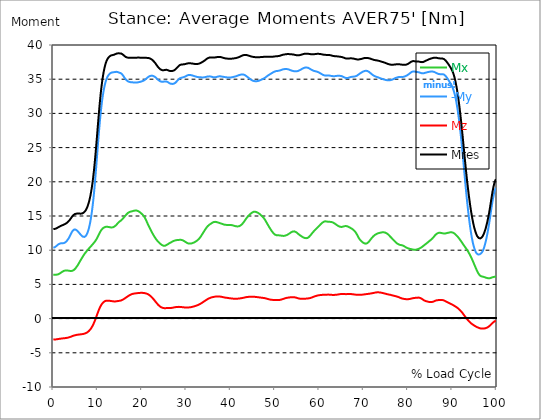
| Category |  Mx |  -My |  Mz |  Mres |
|---|---|---|---|---|
| 0.0 | 6.42 | 10.355 | -3.063 | 13.086 |
| 0.167348456675344 | 6.42 | 10.393 | -3.053 | 13.095 |
| 0.334696913350688 | 6.42 | 10.44 | -3.053 | 13.114 |
| 0.5020453700260321 | 6.42 | 10.516 | -3.044 | 13.152 |
| 0.669393826701376 | 6.42 | 10.601 | -3.034 | 13.19 |
| 0.83674228337672 | 6.429 | 10.705 | -3.015 | 13.247 |
| 1.0040907400520642 | 6.457 | 10.8 | -2.996 | 13.313 |
| 1.1621420602454444 | 6.495 | 10.876 | -2.977 | 13.379 |
| 1.3294905169207885 | 6.552 | 10.933 | -2.958 | 13.436 |
| 1.4968389735961325 | 6.619 | 10.971 | -2.949 | 13.493 |
| 1.6641874302714765 | 6.694 | 10.999 | -2.93 | 13.55 |
| 1.8315358869468206 | 6.77 | 11.009 | -2.911 | 13.598 |
| 1.9988843436221646 | 6.846 | 11.009 | -2.902 | 13.645 |
| 2.1662328002975086 | 6.913 | 11.018 | -2.892 | 13.692 |
| 2.333581256972853 | 6.969 | 11.037 | -2.873 | 13.73 |
| 2.5009297136481967 | 7.007 | 11.075 | -2.864 | 13.778 |
| 2.6682781703235405 | 7.026 | 11.132 | -2.854 | 13.835 |
| 2.8356266269988843 | 7.036 | 11.218 | -2.835 | 13.901 |
| 3.002975083674229 | 7.036 | 11.331 | -2.816 | 13.977 |
| 3.1703235403495724 | 7.026 | 11.464 | -2.797 | 14.062 |
| 3.337671997024917 | 7.017 | 11.625 | -2.778 | 14.167 |
| 3.4957233172182973 | 6.998 | 11.796 | -2.75 | 14.28 |
| 3.663071773893641 | 6.979 | 11.995 | -2.712 | 14.404 |
| 3.8304202305689854 | 6.969 | 12.204 | -2.674 | 14.546 |
| 3.997768687244329 | 6.96 | 12.431 | -2.636 | 14.707 |
| 4.165117143919673 | 6.969 | 12.64 | -2.589 | 14.868 |
| 4.332465600595017 | 6.998 | 12.811 | -2.541 | 15.01 |
| 4.499814057270361 | 7.045 | 12.934 | -2.503 | 15.124 |
| 4.667162513945706 | 7.131 | 13.01 | -2.475 | 15.21 |
| 4.834510970621049 | 7.225 | 13.029 | -2.437 | 15.276 |
| 5.001859427296393 | 7.349 | 13.01 | -2.418 | 15.323 |
| 5.169207883971737 | 7.491 | 12.953 | -2.39 | 15.342 |
| 5.336556340647081 | 7.652 | 12.877 | -2.371 | 15.361 |
| 5.503904797322425 | 7.813 | 12.773 | -2.352 | 15.361 |
| 5.671253253997769 | 7.994 | 12.649 | -2.342 | 15.361 |
| 5.82930457419115 | 8.183 | 12.526 | -2.333 | 15.352 |
| 5.996653030866494 | 8.373 | 12.393 | -2.314 | 15.342 |
| 6.164001487541838 | 8.553 | 12.261 | -2.304 | 15.342 |
| 6.331349944217181 | 8.743 | 12.147 | -2.285 | 15.361 |
| 6.498698400892526 | 8.913 | 12.042 | -2.276 | 15.38 |
| 6.66604685756787 | 9.094 | 11.976 | -2.257 | 15.428 |
| 6.833395314243213 | 9.264 | 11.938 | -2.228 | 15.494 |
| 7.000743770918558 | 9.425 | 11.938 | -2.2 | 15.589 |
| 7.168092227593902 | 9.577 | 11.986 | -2.171 | 15.712 |
| 7.335440684269246 | 9.719 | 12.099 | -2.124 | 15.873 |
| 7.50278914094459 | 9.852 | 12.27 | -2.067 | 16.082 |
| 7.6701375976199335 | 9.975 | 12.498 | -2.001 | 16.328 |
| 7.837486054295278 | 10.108 | 12.801 | -1.915 | 16.632 |
| 7.995537374488658 | 10.231 | 13.171 | -1.821 | 16.983 |
| 8.162885831164003 | 10.355 | 13.626 | -1.707 | 17.409 |
| 8.330234287839346 | 10.478 | 14.157 | -1.584 | 17.893 |
| 8.49758274451469 | 10.592 | 14.783 | -1.432 | 18.471 |
| 8.664931201190035 | 10.715 | 15.513 | -1.261 | 19.126 |
| 8.832279657865378 | 10.838 | 16.347 | -1.071 | 19.884 |
| 8.999628114540721 | 10.962 | 17.296 | -0.853 | 20.747 |
| 9.166976571216066 | 11.094 | 18.358 | -0.616 | 21.714 |
| 9.334325027891412 | 11.227 | 19.543 | -0.351 | 22.795 |
| 9.501673484566755 | 11.379 | 20.833 | -0.066 | 23.99 |
| 9.669021941242098 | 11.549 | 22.198 | 0.228 | 25.261 |
| 9.836370397917442 | 11.73 | 23.601 | 0.522 | 26.588 |
| 10.003718854592787 | 11.938 | 25.005 | 0.825 | 27.925 |
| 10.17106731126813 | 12.156 | 26.38 | 1.109 | 29.253 |
| 10.329118631461512 | 12.374 | 27.688 | 1.375 | 30.523 |
| 10.496467088136853 | 12.592 | 28.902 | 1.621 | 31.718 |
| 10.663815544812199 | 12.792 | 30.011 | 1.83 | 32.809 |
| 10.831164001487544 | 12.962 | 31.007 | 2.02 | 33.776 |
| 10.998512458162887 | 13.095 | 31.879 | 2.181 | 34.629 |
| 11.16586091483823 | 13.209 | 32.638 | 2.314 | 35.369 |
| 11.333209371513574 | 13.285 | 33.292 | 2.418 | 36.004 |
| 11.50055782818892 | 13.342 | 33.861 | 2.503 | 36.545 |
| 11.667906284864264 | 13.389 | 34.335 | 2.56 | 37 |
| 11.835254741539607 | 13.417 | 34.724 | 2.598 | 37.379 |
| 12.00260319821495 | 13.427 | 35.037 | 2.627 | 37.673 |
| 12.169951654890292 | 13.427 | 35.293 | 2.636 | 37.901 |
| 12.337300111565641 | 13.408 | 35.492 | 2.627 | 38.081 |
| 12.504648568240984 | 13.389 | 35.644 | 2.617 | 38.223 |
| 12.662699888434362 | 13.361 | 35.767 | 2.608 | 38.327 |
| 12.830048345109708 | 13.342 | 35.862 | 2.589 | 38.413 |
| 12.997396801785053 | 13.323 | 35.928 | 2.57 | 38.47 |
| 13.164745258460396 | 13.323 | 35.976 | 2.56 | 38.508 |
| 13.33209371513574 | 13.332 | 35.995 | 2.541 | 38.526 |
| 13.499442171811083 | 13.361 | 36.014 | 2.522 | 38.545 |
| 13.666790628486426 | 13.408 | 36.023 | 2.513 | 38.574 |
| 13.834139085161771 | 13.484 | 36.042 | 2.513 | 38.612 |
| 14.001487541837117 | 13.569 | 36.061 | 2.513 | 38.669 |
| 14.16883599851246 | 13.673 | 36.08 | 2.522 | 38.726 |
| 14.336184455187803 | 13.797 | 36.08 | 2.541 | 38.764 |
| 14.503532911863147 | 13.92 | 36.052 | 2.56 | 38.783 |
| 14.670881368538492 | 14.043 | 36.004 | 2.579 | 38.783 |
| 14.828932688731873 | 14.148 | 35.957 | 2.598 | 38.773 |
| 14.996281145407215 | 14.233 | 35.919 | 2.608 | 38.773 |
| 15.163629602082558 | 14.299 | 35.9 | 2.636 | 38.773 |
| 15.330978058757903 | 14.385 | 35.834 | 2.665 | 38.745 |
| 15.498326515433247 | 14.489 | 35.729 | 2.712 | 38.697 |
| 15.665674972108594 | 14.603 | 35.587 | 2.769 | 38.612 |
| 15.833023428783937 | 14.735 | 35.426 | 2.835 | 38.517 |
| 16.00037188545928 | 14.868 | 35.255 | 2.902 | 38.413 |
| 16.167720342134626 | 15.001 | 35.103 | 2.977 | 38.327 |
| 16.335068798809967 | 15.124 | 34.971 | 3.053 | 38.252 |
| 16.502417255485312 | 15.238 | 34.857 | 3.129 | 38.204 |
| 16.669765712160658 | 15.352 | 34.762 | 3.205 | 38.166 |
| 16.837114168836 | 15.456 | 34.686 | 3.281 | 38.138 |
| 17.004462625511344 | 15.532 | 34.639 | 3.347 | 38.128 |
| 17.16251394570472 | 15.579 | 34.601 | 3.414 | 38.119 |
| 17.32986240238007 | 15.627 | 34.572 | 3.471 | 38.119 |
| 17.497210859055414 | 15.655 | 34.553 | 3.527 | 38.119 |
| 17.664559315730756 | 15.674 | 34.544 | 3.575 | 38.128 |
| 17.8319077724061 | 15.703 | 34.544 | 3.603 | 38.128 |
| 17.999256229081443 | 15.741 | 34.534 | 3.632 | 38.138 |
| 18.166604685756788 | 15.769 | 34.515 | 3.651 | 38.147 |
| 18.333953142432133 | 15.797 | 34.506 | 3.67 | 38.147 |
| 18.501301599107478 | 15.807 | 34.506 | 3.689 | 38.147 |
| 18.668650055782823 | 15.807 | 34.506 | 3.698 | 38.147 |
| 18.835998512458165 | 15.788 | 34.515 | 3.717 | 38.157 |
| 19.00334696913351 | 15.75 | 34.525 | 3.727 | 38.157 |
| 19.170695425808855 | 15.703 | 34.553 | 3.736 | 38.157 |
| 19.338043882484197 | 15.636 | 34.572 | 3.745 | 38.157 |
| 19.496095202677576 | 15.56 | 34.601 | 3.755 | 38.157 |
| 19.66344365935292 | 15.475 | 34.629 | 3.764 | 38.147 |
| 19.830792116028263 | 15.38 | 34.658 | 3.764 | 38.138 |
| 19.998140572703612 | 15.276 | 34.696 | 3.764 | 38.128 |
| 20.165489029378953 | 15.172 | 34.743 | 3.764 | 38.128 |
| 20.3328374860543 | 15.048 | 34.79 | 3.755 | 38.128 |
| 20.500185942729644 | 14.897 | 34.847 | 3.736 | 38.128 |
| 20.667534399404985 | 14.716 | 34.923 | 3.717 | 38.119 |
| 20.83488285608033 | 14.508 | 35.009 | 3.689 | 38.119 |
| 21.002231312755672 | 14.271 | 35.113 | 3.66 | 38.119 |
| 21.16957976943102 | 14.024 | 35.208 | 3.613 | 38.119 |
| 21.336928226106362 | 13.787 | 35.293 | 3.565 | 38.109 |
| 21.504276682781704 | 13.56 | 35.369 | 3.499 | 38.09 |
| 21.67162513945705 | 13.342 | 35.435 | 3.433 | 38.062 |
| 21.82967645965043 | 13.123 | 35.473 | 3.347 | 38.024 |
| 21.997024916325774 | 12.915 | 35.502 | 3.252 | 37.967 |
| 22.16437337300112 | 12.706 | 35.521 | 3.148 | 37.901 |
| 22.33172182967646 | 12.498 | 35.511 | 3.034 | 37.815 |
| 22.499070286351806 | 12.308 | 35.483 | 2.911 | 37.711 |
| 22.666418743027148 | 12.118 | 35.445 | 2.788 | 37.597 |
| 22.833767199702496 | 11.948 | 35.378 | 2.646 | 37.474 |
| 23.00111565637784 | 11.777 | 35.303 | 2.513 | 37.341 |
| 23.168464113053183 | 11.616 | 35.208 | 2.38 | 37.189 |
| 23.335812569728528 | 11.474 | 35.094 | 2.247 | 37.028 |
| 23.50316102640387 | 11.341 | 34.99 | 2.124 | 36.877 |
| 23.670509483079215 | 11.218 | 34.895 | 2.001 | 36.734 |
| 23.83785793975456 | 11.113 | 34.809 | 1.896 | 36.621 |
| 23.995909259947936 | 11.009 | 34.734 | 1.802 | 36.516 |
| 24.163257716623285 | 10.914 | 34.677 | 1.726 | 36.431 |
| 24.330606173298627 | 10.829 | 34.648 | 1.659 | 36.365 |
| 24.49795462997397 | 10.753 | 34.629 | 1.612 | 36.327 |
| 24.665303086649313 | 10.687 | 34.629 | 1.574 | 36.308 |
| 24.83265154332466 | 10.649 | 34.639 | 1.536 | 36.308 |
| 25.0 | 10.63 | 34.658 | 1.527 | 36.317 |
| 25.167348456675345 | 10.649 | 34.677 | 1.517 | 36.346 |
| 25.334696913350694 | 10.696 | 34.696 | 1.527 | 36.374 |
| 25.502045370026035 | 10.753 | 34.677 | 1.536 | 36.383 |
| 25.669393826701377 | 10.819 | 34.639 | 1.546 | 36.365 |
| 25.836742283376722 | 10.876 | 34.572 | 1.536 | 36.317 |
| 26.004090740052067 | 10.943 | 34.487 | 1.536 | 36.27 |
| 26.17143919672741 | 11.018 | 34.421 | 1.536 | 36.222 |
| 26.329490516920792 | 11.075 | 34.364 | 1.536 | 36.194 |
| 26.49683897359613 | 11.132 | 34.335 | 1.546 | 36.184 |
| 26.66418743027148 | 11.189 | 34.316 | 1.565 | 36.184 |
| 26.831535886946828 | 11.255 | 34.307 | 1.584 | 36.203 |
| 26.998884343622166 | 11.312 | 34.316 | 1.603 | 36.232 |
| 27.166232800297514 | 11.36 | 34.345 | 1.621 | 36.27 |
| 27.333581256972852 | 11.398 | 34.392 | 1.65 | 36.336 |
| 27.5009297136482 | 11.436 | 34.468 | 1.669 | 36.412 |
| 27.668278170323543 | 11.455 | 34.572 | 1.688 | 36.526 |
| 27.835626626998888 | 11.474 | 34.686 | 1.697 | 36.63 |
| 28.002975083674233 | 11.493 | 34.8 | 1.707 | 36.744 |
| 28.170323540349575 | 11.502 | 34.914 | 1.716 | 36.858 |
| 28.33767199702492 | 11.511 | 35.028 | 1.716 | 36.971 |
| 28.50502045370026 | 11.511 | 35.113 | 1.716 | 37.057 |
| 28.663071773893645 | 11.511 | 35.17 | 1.707 | 37.104 |
| 28.830420230568986 | 11.511 | 35.208 | 1.697 | 37.142 |
| 28.99776868724433 | 11.493 | 35.236 | 1.678 | 37.152 |
| 29.165117143919673 | 11.455 | 35.255 | 1.669 | 37.161 |
| 29.33246560059502 | 11.398 | 35.284 | 1.65 | 37.171 |
| 29.499814057270367 | 11.341 | 35.321 | 1.64 | 37.18 |
| 29.66716251394571 | 11.274 | 35.369 | 1.631 | 37.199 |
| 29.834510970621054 | 11.199 | 35.426 | 1.621 | 37.227 |
| 30.00185942729639 | 11.132 | 35.483 | 1.612 | 37.256 |
| 30.169207883971744 | 11.066 | 35.54 | 1.621 | 37.294 |
| 30.33655634064708 | 11.009 | 35.587 | 1.621 | 37.313 |
| 30.50390479732243 | 10.971 | 35.615 | 1.631 | 37.332 |
| 30.671253253997772 | 10.952 | 35.625 | 1.64 | 37.341 |
| 30.829304574191156 | 10.962 | 35.615 | 1.65 | 37.332 |
| 30.996653030866494 | 10.971 | 35.606 | 1.669 | 37.322 |
| 31.164001487541842 | 10.99 | 35.578 | 1.688 | 37.303 |
| 31.331349944217187 | 11.018 | 35.549 | 1.716 | 37.284 |
| 31.498698400892525 | 11.066 | 35.521 | 1.735 | 37.275 |
| 31.666046857567874 | 11.113 | 35.483 | 1.773 | 37.256 |
| 31.833395314243212 | 11.161 | 35.445 | 1.802 | 37.237 |
| 32.00074377091856 | 11.227 | 35.416 | 1.84 | 37.227 |
| 32.1680922275939 | 11.293 | 35.378 | 1.877 | 37.218 |
| 32.33544068426925 | 11.369 | 35.35 | 1.915 | 37.218 |
| 32.50278914094459 | 11.445 | 35.321 | 1.963 | 37.227 |
| 32.670137597619934 | 11.53 | 35.303 | 2.001 | 37.237 |
| 32.83748605429528 | 11.644 | 35.293 | 2.048 | 37.265 |
| 33.004834510970625 | 11.768 | 35.284 | 2.105 | 37.303 |
| 33.162885831164004 | 11.919 | 35.274 | 2.162 | 37.36 |
| 33.33023428783935 | 12.08 | 35.274 | 2.228 | 37.417 |
| 33.497582744514695 | 12.251 | 35.265 | 2.304 | 37.474 |
| 33.664931201190036 | 12.422 | 35.265 | 2.371 | 37.531 |
| 33.83227965786538 | 12.592 | 35.265 | 2.437 | 37.597 |
| 33.99962811454073 | 12.763 | 35.274 | 2.513 | 37.673 |
| 34.16697657121607 | 12.934 | 35.284 | 2.579 | 37.749 |
| 34.33432502789141 | 13.095 | 35.312 | 2.655 | 37.834 |
| 34.50167348456676 | 13.256 | 35.35 | 2.721 | 37.929 |
| 34.6690219412421 | 13.398 | 35.378 | 2.797 | 38.005 |
| 34.83637039791744 | 13.522 | 35.397 | 2.854 | 38.071 |
| 35.00371885459279 | 13.626 | 35.407 | 2.921 | 38.119 |
| 35.17106731126814 | 13.721 | 35.416 | 2.968 | 38.157 |
| 35.338415767943474 | 13.797 | 35.407 | 3.015 | 38.176 |
| 35.49646708813686 | 13.863 | 35.397 | 3.063 | 38.185 |
| 35.6638155448122 | 13.929 | 35.369 | 3.101 | 38.195 |
| 35.831164001487544 | 14.005 | 35.331 | 3.129 | 38.185 |
| 35.998512458162885 | 14.072 | 35.293 | 3.148 | 38.176 |
| 36.165860914838234 | 14.119 | 35.274 | 3.177 | 38.176 |
| 36.333209371513576 | 14.148 | 35.265 | 3.196 | 38.176 |
| 36.50055782818892 | 14.148 | 35.274 | 3.214 | 38.185 |
| 36.667906284864266 | 14.138 | 35.303 | 3.224 | 38.204 |
| 36.83525474153961 | 14.11 | 35.331 | 3.233 | 38.223 |
| 37.002603198214956 | 14.081 | 35.369 | 3.243 | 38.252 |
| 37.1699516548903 | 14.043 | 35.397 | 3.243 | 38.261 |
| 37.337300111565646 | 14.005 | 35.416 | 3.243 | 38.27 |
| 37.50464856824098 | 13.967 | 35.426 | 3.233 | 38.261 |
| 37.66269988843437 | 13.939 | 35.426 | 3.214 | 38.252 |
| 37.83004834510971 | 13.901 | 35.407 | 3.196 | 38.223 |
| 37.99739680178505 | 13.854 | 35.397 | 3.177 | 38.195 |
| 38.16474525846039 | 13.825 | 35.369 | 3.148 | 38.157 |
| 38.33209371513574 | 13.787 | 35.35 | 3.129 | 38.128 |
| 38.49944217181109 | 13.749 | 35.331 | 3.101 | 38.09 |
| 38.666790628486424 | 13.73 | 35.312 | 3.082 | 38.062 |
| 38.83413908516178 | 13.711 | 35.293 | 3.063 | 38.043 |
| 39.001487541837115 | 13.702 | 35.274 | 3.044 | 38.024 |
| 39.16883599851246 | 13.692 | 35.265 | 3.034 | 38.014 |
| 39.336184455187805 | 13.692 | 35.255 | 3.025 | 38.005 |
| 39.503532911863154 | 13.692 | 35.246 | 3.006 | 37.995 |
| 39.670881368538495 | 13.692 | 35.246 | 2.987 | 37.986 |
| 39.83822982521384 | 13.692 | 35.246 | 2.977 | 37.986 |
| 39.996281145407224 | 13.683 | 35.246 | 2.958 | 37.986 |
| 40.163629602082565 | 13.673 | 35.265 | 2.94 | 37.995 |
| 40.33097805875791 | 13.654 | 35.284 | 2.93 | 38.005 |
| 40.498326515433256 | 13.626 | 35.312 | 2.921 | 38.024 |
| 40.6656749721086 | 13.598 | 35.34 | 2.911 | 38.033 |
| 40.83302342878393 | 13.56 | 35.369 | 2.911 | 38.052 |
| 41.00037188545929 | 13.531 | 35.397 | 2.902 | 38.071 |
| 41.16772034213463 | 13.503 | 35.426 | 2.902 | 38.09 |
| 41.33506879880997 | 13.484 | 35.464 | 2.911 | 38.109 |
| 41.50241725548531 | 13.474 | 35.502 | 2.911 | 38.147 |
| 41.66976571216066 | 13.474 | 35.549 | 2.921 | 38.185 |
| 41.837114168836 | 13.493 | 35.587 | 2.93 | 38.223 |
| 42.004462625511344 | 13.531 | 35.615 | 2.94 | 38.27 |
| 42.17181108218669 | 13.588 | 35.653 | 2.958 | 38.318 |
| 42.32986240238007 | 13.664 | 35.672 | 2.977 | 38.375 |
| 42.497210859055414 | 13.759 | 35.691 | 2.996 | 38.422 |
| 42.66455931573076 | 13.873 | 35.701 | 3.015 | 38.47 |
| 42.831907772406105 | 14.005 | 35.691 | 3.044 | 38.508 |
| 42.999256229081446 | 14.148 | 35.663 | 3.063 | 38.536 |
| 43.16660468575679 | 14.309 | 35.615 | 3.091 | 38.555 |
| 43.33395314243214 | 14.47 | 35.549 | 3.11 | 38.555 |
| 43.50130159910748 | 14.622 | 35.473 | 3.139 | 38.545 |
| 43.66865005578282 | 14.764 | 35.397 | 3.158 | 38.517 |
| 43.83599851245817 | 14.897 | 35.303 | 3.167 | 38.489 |
| 44.00334696913351 | 15.02 | 35.217 | 3.177 | 38.46 |
| 44.17069542580886 | 15.134 | 35.132 | 3.196 | 38.422 |
| 44.3380438824842 | 15.238 | 35.056 | 3.196 | 38.384 |
| 44.49609520267758 | 15.333 | 34.971 | 3.205 | 38.346 |
| 44.66344365935292 | 15.418 | 34.904 | 3.205 | 38.318 |
| 44.83079211602827 | 15.494 | 34.838 | 3.205 | 38.289 |
| 44.99814057270361 | 15.56 | 34.781 | 3.205 | 38.27 |
| 45.16548902937895 | 15.608 | 34.743 | 3.196 | 38.252 |
| 45.332837486054295 | 15.627 | 34.715 | 3.186 | 38.233 |
| 45.500185942729644 | 15.627 | 34.705 | 3.177 | 38.223 |
| 45.66753439940499 | 15.608 | 34.696 | 3.167 | 38.214 |
| 45.83488285608033 | 15.57 | 34.705 | 3.148 | 38.204 |
| 46.00223131275568 | 15.522 | 34.715 | 3.139 | 38.204 |
| 46.16957976943102 | 15.466 | 34.743 | 3.12 | 38.204 |
| 46.336928226106366 | 15.39 | 34.772 | 3.11 | 38.204 |
| 46.50427668278171 | 15.314 | 34.809 | 3.091 | 38.214 |
| 46.671625139457056 | 15.219 | 34.857 | 3.082 | 38.223 |
| 46.829676459650436 | 15.124 | 34.904 | 3.063 | 38.242 |
| 46.99702491632577 | 15.029 | 34.952 | 3.053 | 38.252 |
| 47.16437337300112 | 14.925 | 34.999 | 3.044 | 38.252 |
| 47.33172182967646 | 14.802 | 35.046 | 3.025 | 38.261 |
| 47.49907028635181 | 14.669 | 35.113 | 3.015 | 38.27 |
| 47.66641874302716 | 14.517 | 35.179 | 2.996 | 38.27 |
| 47.83376719970249 | 14.347 | 35.246 | 2.977 | 38.27 |
| 48.001115656377834 | 14.157 | 35.331 | 2.94 | 38.27 |
| 48.16846411305319 | 13.967 | 35.416 | 2.902 | 38.28 |
| 48.33581256972853 | 13.778 | 35.502 | 2.873 | 38.28 |
| 48.50316102640387 | 13.598 | 35.578 | 2.845 | 38.28 |
| 48.67050948307921 | 13.408 | 35.644 | 2.816 | 38.27 |
| 48.837857939754564 | 13.237 | 35.71 | 2.788 | 38.27 |
| 49.005206396429905 | 13.067 | 35.777 | 2.769 | 38.27 |
| 49.163257716623285 | 12.896 | 35.843 | 2.75 | 38.27 |
| 49.33060617329863 | 12.735 | 35.909 | 2.74 | 38.28 |
| 49.49795462997397 | 12.592 | 35.976 | 2.731 | 38.289 |
| 49.66530308664932 | 12.469 | 36.033 | 2.731 | 38.299 |
| 49.832651543324666 | 12.355 | 36.09 | 2.721 | 38.318 |
| 50.0 | 12.28 | 36.137 | 2.712 | 38.337 |
| 50.16734845667534 | 12.223 | 36.175 | 2.712 | 38.346 |
| 50.33469691335069 | 12.194 | 36.194 | 2.702 | 38.356 |
| 50.50204537002604 | 12.175 | 36.203 | 2.702 | 38.365 |
| 50.66939382670139 | 12.175 | 36.213 | 2.702 | 38.375 |
| 50.836742283376715 | 12.166 | 36.232 | 2.712 | 38.384 |
| 51.00409074005207 | 12.166 | 36.251 | 2.721 | 38.413 |
| 51.17143919672741 | 12.147 | 36.289 | 2.74 | 38.441 |
| 51.32949051692079 | 12.137 | 36.336 | 2.769 | 38.479 |
| 51.496838973596134 | 12.118 | 36.374 | 2.797 | 38.517 |
| 51.66418743027148 | 12.099 | 36.412 | 2.835 | 38.555 |
| 51.831535886946824 | 12.09 | 36.45 | 2.873 | 38.583 |
| 51.99888434362217 | 12.09 | 36.469 | 2.911 | 38.602 |
| 52.16623280029752 | 12.109 | 36.478 | 2.949 | 38.621 |
| 52.33358125697285 | 12.137 | 36.488 | 2.977 | 38.64 |
| 52.5009297136482 | 12.175 | 36.488 | 3.015 | 38.65 |
| 52.668278170323546 | 12.213 | 36.488 | 3.034 | 38.669 |
| 52.835626626998895 | 12.27 | 36.469 | 3.053 | 38.678 |
| 53.00297508367424 | 12.336 | 36.44 | 3.072 | 38.678 |
| 53.17032354034958 | 12.403 | 36.402 | 3.091 | 38.669 |
| 53.33767199702492 | 12.479 | 36.365 | 3.101 | 38.659 |
| 53.50502045370027 | 12.555 | 36.317 | 3.12 | 38.65 |
| 53.663071773893655 | 12.63 | 36.279 | 3.129 | 38.64 |
| 53.83042023056899 | 12.697 | 36.241 | 3.139 | 38.631 |
| 53.99776868724433 | 12.735 | 36.203 | 3.139 | 38.621 |
| 54.16511714391967 | 12.754 | 36.184 | 3.129 | 38.602 |
| 54.33246560059503 | 12.754 | 36.156 | 3.12 | 38.574 |
| 54.49981405727037 | 12.725 | 36.146 | 3.101 | 38.555 |
| 54.667162513945705 | 12.678 | 36.137 | 3.082 | 38.526 |
| 54.834510970621054 | 12.611 | 36.146 | 3.053 | 38.508 |
| 55.0018594272964 | 12.526 | 36.165 | 3.015 | 38.489 |
| 55.169207883971744 | 12.431 | 36.194 | 2.977 | 38.489 |
| 55.336556340647086 | 12.336 | 36.241 | 2.949 | 38.498 |
| 55.50390479732243 | 12.251 | 36.289 | 2.921 | 38.508 |
| 55.671253253997776 | 12.166 | 36.346 | 2.902 | 38.536 |
| 55.83860171067312 | 12.09 | 36.402 | 2.892 | 38.564 |
| 55.9966530308665 | 12.024 | 36.469 | 2.892 | 38.593 |
| 56.16400148754184 | 11.948 | 36.535 | 2.892 | 38.631 |
| 56.33134994421718 | 11.891 | 36.592 | 2.902 | 38.659 |
| 56.498698400892536 | 11.843 | 36.64 | 2.902 | 38.697 |
| 56.66604685756788 | 11.796 | 36.677 | 2.911 | 38.716 |
| 56.83339531424321 | 11.768 | 36.706 | 2.921 | 38.726 |
| 57.00074377091856 | 11.758 | 36.715 | 2.921 | 38.735 |
| 57.16809222759391 | 11.758 | 36.706 | 2.93 | 38.735 |
| 57.33544068426925 | 11.786 | 36.687 | 2.94 | 38.735 |
| 57.5027891409446 | 11.853 | 36.658 | 2.949 | 38.716 |
| 57.670137597619934 | 11.938 | 36.602 | 2.968 | 38.697 |
| 57.83748605429528 | 12.042 | 36.535 | 2.987 | 38.678 |
| 58.004834510970625 | 12.175 | 36.469 | 3.015 | 38.659 |
| 58.16288583116401 | 12.308 | 36.402 | 3.053 | 38.65 |
| 58.330234287839346 | 12.441 | 36.346 | 3.091 | 38.64 |
| 58.497582744514695 | 12.583 | 36.289 | 3.129 | 38.64 |
| 58.66493120119004 | 12.706 | 36.241 | 3.177 | 38.64 |
| 58.832279657865385 | 12.83 | 36.203 | 3.214 | 38.65 |
| 58.999628114540734 | 12.934 | 36.184 | 3.262 | 38.669 |
| 59.16697657121607 | 13.038 | 36.156 | 3.29 | 38.688 |
| 59.33432502789142 | 13.152 | 36.127 | 3.328 | 38.697 |
| 59.50167348456676 | 13.256 | 36.099 | 3.357 | 38.707 |
| 59.66902194124211 | 13.37 | 36.052 | 3.385 | 38.707 |
| 59.83637039791745 | 13.474 | 36.004 | 3.404 | 38.707 |
| 60.00371885459278 | 13.588 | 35.947 | 3.423 | 38.697 |
| 60.17106731126813 | 13.702 | 35.89 | 3.442 | 38.688 |
| 60.33841576794349 | 13.816 | 35.824 | 3.452 | 38.669 |
| 60.49646708813685 | 13.92 | 35.758 | 3.461 | 38.65 |
| 60.6638155448122 | 14.015 | 35.701 | 3.471 | 38.631 |
| 60.831164001487544 | 14.091 | 35.634 | 3.471 | 38.602 |
| 60.99851245816289 | 14.157 | 35.587 | 3.48 | 38.583 |
| 61.16586091483824 | 14.195 | 35.549 | 3.48 | 38.564 |
| 61.333209371513576 | 14.223 | 35.53 | 3.489 | 38.555 |
| 61.50055782818892 | 14.214 | 35.521 | 3.489 | 38.555 |
| 61.667906284864266 | 14.195 | 35.53 | 3.499 | 38.555 |
| 61.835254741539615 | 14.176 | 35.54 | 3.508 | 38.555 |
| 62.002603198214956 | 14.157 | 35.549 | 3.508 | 38.555 |
| 62.16995165489029 | 14.148 | 35.54 | 3.499 | 38.545 |
| 62.33730011156564 | 14.148 | 35.521 | 3.499 | 38.526 |
| 62.504648568240995 | 14.138 | 35.502 | 3.489 | 38.508 |
| 62.67199702491633 | 14.129 | 35.483 | 3.48 | 38.479 |
| 62.83004834510971 | 14.11 | 35.464 | 3.471 | 38.451 |
| 62.99739680178505 | 14.072 | 35.445 | 3.461 | 38.422 |
| 63.1647452584604 | 14.024 | 35.435 | 3.461 | 38.394 |
| 63.33209371513575 | 13.958 | 35.435 | 3.461 | 38.375 |
| 63.4994421718111 | 13.882 | 35.445 | 3.471 | 38.365 |
| 63.666790628486424 | 13.806 | 35.464 | 3.48 | 38.365 |
| 63.83413908516177 | 13.721 | 35.483 | 3.489 | 38.356 |
| 64.00148754183712 | 13.654 | 35.492 | 3.499 | 38.346 |
| 64.16883599851248 | 13.579 | 35.492 | 3.518 | 38.327 |
| 64.3361844551878 | 13.522 | 35.502 | 3.537 | 38.318 |
| 64.50353291186315 | 13.465 | 35.492 | 3.556 | 38.299 |
| 64.6708813685385 | 13.427 | 35.492 | 3.575 | 38.289 |
| 64.83822982521384 | 13.398 | 35.483 | 3.584 | 38.27 |
| 65.00557828188919 | 13.398 | 35.454 | 3.594 | 38.252 |
| 65.16362960208257 | 13.417 | 35.416 | 3.603 | 38.223 |
| 65.3309780587579 | 13.446 | 35.369 | 3.603 | 38.185 |
| 65.49832651543326 | 13.484 | 35.312 | 3.594 | 38.147 |
| 65.6656749721086 | 13.512 | 35.255 | 3.584 | 38.1 |
| 65.83302342878395 | 13.522 | 35.208 | 3.584 | 38.062 |
| 66.00037188545929 | 13.531 | 35.17 | 3.575 | 38.033 |
| 66.16772034213463 | 13.522 | 35.151 | 3.575 | 38.014 |
| 66.33506879880998 | 13.493 | 35.16 | 3.584 | 38.005 |
| 66.50241725548531 | 13.446 | 35.189 | 3.584 | 38.014 |
| 66.66976571216065 | 13.389 | 35.227 | 3.594 | 38.033 |
| 66.83711416883601 | 13.332 | 35.265 | 3.594 | 38.043 |
| 67.00446262551135 | 13.266 | 35.303 | 3.594 | 38.052 |
| 67.1718110821867 | 13.209 | 35.331 | 3.584 | 38.052 |
| 67.32986240238007 | 13.142 | 35.35 | 3.575 | 38.052 |
| 67.49721085905541 | 13.067 | 35.359 | 3.565 | 38.033 |
| 67.66455931573076 | 12.981 | 35.369 | 3.546 | 38.014 |
| 67.83190777240611 | 12.886 | 35.388 | 3.527 | 37.995 |
| 67.99925622908145 | 12.773 | 35.397 | 3.518 | 37.967 |
| 68.16660468575678 | 12.64 | 35.426 | 3.499 | 37.939 |
| 68.33395314243214 | 12.479 | 35.464 | 3.489 | 37.91 |
| 68.50130159910749 | 12.28 | 35.521 | 3.48 | 37.891 |
| 68.66865005578282 | 12.071 | 35.596 | 3.471 | 37.882 |
| 68.83599851245816 | 11.862 | 35.682 | 3.471 | 37.882 |
| 69.00334696913352 | 11.692 | 35.758 | 3.471 | 37.901 |
| 69.17069542580886 | 11.54 | 35.834 | 3.48 | 37.92 |
| 69.3380438824842 | 11.417 | 35.909 | 3.48 | 37.939 |
| 69.50539233915956 | 11.303 | 35.976 | 3.489 | 37.967 |
| 69.66344365935292 | 11.208 | 36.042 | 3.499 | 38.005 |
| 69.83079211602826 | 11.123 | 36.099 | 3.508 | 38.033 |
| 69.99814057270362 | 11.056 | 36.156 | 3.527 | 38.062 |
| 70.16548902937896 | 10.999 | 36.194 | 3.537 | 38.09 |
| 70.33283748605429 | 10.962 | 36.222 | 3.556 | 38.1 |
| 70.50018594272964 | 10.952 | 36.232 | 3.565 | 38.109 |
| 70.667534399405 | 10.98 | 36.222 | 3.584 | 38.119 |
| 70.83488285608033 | 11.037 | 36.203 | 3.594 | 38.109 |
| 71.00223131275568 | 11.123 | 36.156 | 3.613 | 38.1 |
| 71.16957976943102 | 11.227 | 36.09 | 3.622 | 38.071 |
| 71.33692822610637 | 11.369 | 36.004 | 3.641 | 38.043 |
| 71.50427668278171 | 11.511 | 35.909 | 3.66 | 38.005 |
| 71.67162513945706 | 11.654 | 35.815 | 3.679 | 37.967 |
| 71.8389735961324 | 11.786 | 35.729 | 3.698 | 37.929 |
| 71.99702491632577 | 11.9 | 35.644 | 3.717 | 37.891 |
| 72.16437337300113 | 12.024 | 35.568 | 3.745 | 37.853 |
| 72.33172182967647 | 12.118 | 35.502 | 3.764 | 37.825 |
| 72.49907028635181 | 12.213 | 35.445 | 3.793 | 37.796 |
| 72.66641874302715 | 12.289 | 35.397 | 3.812 | 37.777 |
| 72.8337671997025 | 12.346 | 35.359 | 3.831 | 37.768 |
| 73.00111565637783 | 12.403 | 35.331 | 3.84 | 37.749 |
| 73.16846411305319 | 12.45 | 35.293 | 3.84 | 37.721 |
| 73.33581256972853 | 12.488 | 35.255 | 3.84 | 37.702 |
| 73.50316102640387 | 12.517 | 35.208 | 3.831 | 37.673 |
| 73.67050948307921 | 12.545 | 35.17 | 3.821 | 37.635 |
| 73.83785793975457 | 12.574 | 35.122 | 3.802 | 37.607 |
| 74.00520639642991 | 12.592 | 35.084 | 3.783 | 37.569 |
| 74.16325771662328 | 12.611 | 35.046 | 3.764 | 37.531 |
| 74.33060617329863 | 12.621 | 35.009 | 3.736 | 37.502 |
| 74.49795462997398 | 12.621 | 34.98 | 3.708 | 37.474 |
| 74.66530308664932 | 12.611 | 34.942 | 3.679 | 37.436 |
| 74.83265154332466 | 12.583 | 34.914 | 3.651 | 37.398 |
| 75.00000000000001 | 12.536 | 34.885 | 3.622 | 37.351 |
| 75.16734845667534 | 12.479 | 34.866 | 3.594 | 37.313 |
| 75.3346969133507 | 12.403 | 34.847 | 3.565 | 37.265 |
| 75.50204537002605 | 12.317 | 34.838 | 3.546 | 37.227 |
| 75.66939382670138 | 12.213 | 34.828 | 3.518 | 37.189 |
| 75.83674228337672 | 12.099 | 34.838 | 3.499 | 37.161 |
| 76.00409074005208 | 11.995 | 34.857 | 3.48 | 37.142 |
| 76.17143919672742 | 11.881 | 34.885 | 3.452 | 37.123 |
| 76.33878765340276 | 11.758 | 34.914 | 3.423 | 37.123 |
| 76.49683897359614 | 11.644 | 34.952 | 3.395 | 37.114 |
| 76.66418743027148 | 11.53 | 35.009 | 3.366 | 37.123 |
| 76.83153588694682 | 11.417 | 35.056 | 3.338 | 37.133 |
| 76.99888434362218 | 11.303 | 35.113 | 3.309 | 37.152 |
| 77.16623280029752 | 11.199 | 35.17 | 3.281 | 37.161 |
| 77.33358125697285 | 11.104 | 35.208 | 3.252 | 37.171 |
| 77.5009297136482 | 11.009 | 35.246 | 3.224 | 37.18 |
| 77.66827817032356 | 10.933 | 35.274 | 3.196 | 37.18 |
| 77.83562662699889 | 10.876 | 35.303 | 3.148 | 37.18 |
| 78.00297508367423 | 10.819 | 35.321 | 3.11 | 37.18 |
| 78.17032354034959 | 10.781 | 35.331 | 3.063 | 37.171 |
| 78.33767199702493 | 10.753 | 35.34 | 3.015 | 37.161 |
| 78.50502045370027 | 10.743 | 35.34 | 2.977 | 37.142 |
| 78.67236891037561 | 10.724 | 35.331 | 2.94 | 37.123 |
| 78.83042023056899 | 10.687 | 35.331 | 2.911 | 37.104 |
| 78.99776868724433 | 10.639 | 35.35 | 2.892 | 37.095 |
| 79.16511714391969 | 10.573 | 35.378 | 2.873 | 37.095 |
| 79.33246560059503 | 10.506 | 35.416 | 2.854 | 37.104 |
| 79.49981405727036 | 10.431 | 35.464 | 2.845 | 37.114 |
| 79.66716251394571 | 10.364 | 35.521 | 2.835 | 37.142 |
| 79.83451097062107 | 10.317 | 35.578 | 2.835 | 37.18 |
| 80.00185942729641 | 10.279 | 35.653 | 2.835 | 37.237 |
| 80.16920788397174 | 10.241 | 35.729 | 2.845 | 37.303 |
| 80.33655634064709 | 10.212 | 35.815 | 2.864 | 37.379 |
| 80.50390479732243 | 10.184 | 35.9 | 2.892 | 37.455 |
| 80.67125325399778 | 10.156 | 35.985 | 2.911 | 37.521 |
| 80.83860171067312 | 10.137 | 36.061 | 2.94 | 37.588 |
| 80.99665303086651 | 10.108 | 36.109 | 2.968 | 37.626 |
| 81.16400148754184 | 10.089 | 36.137 | 2.987 | 37.654 |
| 81.3313499442172 | 10.07 | 36.137 | 3.006 | 37.654 |
| 81.49869840089255 | 10.061 | 36.118 | 3.015 | 37.626 |
| 81.66604685756786 | 10.061 | 36.09 | 3.034 | 37.607 |
| 81.83339531424322 | 10.08 | 36.071 | 3.044 | 37.588 |
| 82.00074377091858 | 10.099 | 36.052 | 3.053 | 37.578 |
| 82.16809222759392 | 10.137 | 36.042 | 3.063 | 37.578 |
| 82.33544068426926 | 10.174 | 36.023 | 3.072 | 37.578 |
| 82.50278914094459 | 10.222 | 36.004 | 3.063 | 37.569 |
| 82.67013759761994 | 10.279 | 35.966 | 3.034 | 37.55 |
| 82.83748605429528 | 10.336 | 35.928 | 2.996 | 37.521 |
| 83.00483451097062 | 10.402 | 35.89 | 2.94 | 37.502 |
| 83.17218296764597 | 10.478 | 35.862 | 2.873 | 37.493 |
| 83.33023428783935 | 10.563 | 35.852 | 2.797 | 37.493 |
| 83.4975827445147 | 10.649 | 35.862 | 2.721 | 37.531 |
| 83.66493120119004 | 10.734 | 35.89 | 2.655 | 37.578 |
| 83.83227965786537 | 10.819 | 35.928 | 2.608 | 37.635 |
| 83.99962811454073 | 10.895 | 35.957 | 2.56 | 37.683 |
| 84.16697657121607 | 10.98 | 35.985 | 2.532 | 37.739 |
| 84.33432502789142 | 11.075 | 36.023 | 2.503 | 37.787 |
| 84.50167348456677 | 11.161 | 36.042 | 2.475 | 37.844 |
| 84.6690219412421 | 11.255 | 36.071 | 2.446 | 37.891 |
| 84.83637039791745 | 11.341 | 36.09 | 2.427 | 37.939 |
| 85.0037188545928 | 11.426 | 36.099 | 2.418 | 37.977 |
| 85.17106731126813 | 11.511 | 36.118 | 2.418 | 38.014 |
| 85.33841576794349 | 11.606 | 36.118 | 2.418 | 38.052 |
| 85.50576422461883 | 11.711 | 36.118 | 2.437 | 38.081 |
| 85.66381554481221 | 11.834 | 36.109 | 2.465 | 38.109 |
| 85.83116400148755 | 11.957 | 36.09 | 2.503 | 38.138 |
| 85.99851245816289 | 12.099 | 36.042 | 2.56 | 38.147 |
| 86.16586091483823 | 12.223 | 35.985 | 2.617 | 38.147 |
| 86.33320937151358 | 12.327 | 35.928 | 2.655 | 38.138 |
| 86.50055782818893 | 12.412 | 35.871 | 2.674 | 38.119 |
| 86.66790628486427 | 12.479 | 35.824 | 2.693 | 38.09 |
| 86.83525474153961 | 12.526 | 35.777 | 2.702 | 38.071 |
| 87.00260319821496 | 12.555 | 35.748 | 2.712 | 38.052 |
| 87.16995165489031 | 12.555 | 35.739 | 2.721 | 38.043 |
| 87.33730011156564 | 12.536 | 35.729 | 2.731 | 38.043 |
| 87.504648568241 | 12.517 | 35.739 | 2.731 | 38.033 |
| 87.67199702491634 | 12.498 | 35.739 | 2.721 | 38.033 |
| 87.83004834510972 | 12.469 | 35.739 | 2.712 | 38.014 |
| 87.99739680178506 | 12.45 | 35.71 | 2.683 | 37.977 |
| 88.1647452584604 | 12.441 | 35.663 | 2.636 | 37.92 |
| 88.33209371513574 | 12.441 | 35.578 | 2.589 | 37.834 |
| 88.49944217181108 | 12.46 | 35.464 | 2.532 | 37.73 |
| 88.66679062848644 | 12.488 | 35.331 | 2.475 | 37.597 |
| 88.83413908516178 | 12.517 | 35.179 | 2.427 | 37.455 |
| 89.00148754183712 | 12.545 | 35.018 | 2.371 | 37.303 |
| 89.16883599851246 | 12.564 | 34.847 | 2.314 | 37.152 |
| 89.33618445518782 | 12.592 | 34.667 | 2.257 | 36.981 |
| 89.50353291186315 | 12.611 | 34.487 | 2.209 | 36.82 |
| 89.6708813685385 | 12.621 | 34.307 | 2.152 | 36.64 |
| 89.83822982521386 | 12.621 | 34.108 | 2.096 | 36.45 |
| 90.00557828188919 | 12.602 | 33.871 | 2.048 | 36.222 |
| 90.16362960208257 | 12.564 | 33.605 | 1.982 | 35.957 |
| 90.3309780587579 | 12.507 | 33.283 | 1.915 | 35.634 |
| 90.49832651543326 | 12.441 | 32.913 | 1.849 | 35.255 |
| 90.66567497210859 | 12.346 | 32.467 | 1.783 | 34.809 |
| 90.83302342878395 | 12.232 | 31.946 | 1.716 | 34.288 |
| 91.00037188545929 | 12.128 | 31.348 | 1.64 | 33.7 |
| 91.16772034213463 | 12.005 | 30.685 | 1.565 | 33.046 |
| 91.33506879880998 | 11.881 | 29.945 | 1.479 | 32.316 |
| 91.50241725548533 | 11.749 | 29.139 | 1.384 | 31.529 |
| 91.66976571216065 | 11.597 | 28.257 | 1.28 | 30.666 |
| 91.83711416883601 | 11.445 | 27.309 | 1.166 | 29.746 |
| 92.00446262551137 | 11.293 | 26.294 | 1.053 | 28.76 |
| 92.1718110821867 | 11.132 | 25.213 | 0.92 | 27.717 |
| 92.33915953886203 | 10.971 | 24.085 | 0.787 | 26.645 |
| 92.49721085905541 | 10.81 | 22.919 | 0.635 | 25.536 |
| 92.66455931573077 | 10.658 | 21.733 | 0.493 | 24.417 |
| 92.83190777240611 | 10.506 | 20.539 | 0.341 | 23.307 |
| 92.99925622908145 | 10.355 | 19.372 | 0.199 | 22.217 |
| 93.1666046857568 | 10.203 | 18.244 | 0.057 | 21.174 |
| 93.33395314243214 | 10.042 | 17.172 | -0.076 | 20.178 |
| 93.50130159910749 | 9.871 | 16.167 | -0.199 | 19.24 |
| 93.66865005578283 | 9.681 | 15.219 | -0.322 | 18.339 |
| 93.83599851245818 | 9.492 | 14.337 | -0.436 | 17.495 |
| 94.00334696913353 | 9.283 | 13.512 | -0.54 | 16.698 |
| 94.17069542580886 | 9.075 | 12.773 | -0.645 | 15.968 |
| 94.3380438824842 | 8.847 | 12.099 | -0.74 | 15.285 |
| 94.50539233915954 | 8.61 | 11.511 | -0.825 | 14.679 |
| 94.66344365935292 | 8.363 | 11.009 | -0.901 | 14.119 |
| 94.83079211602828 | 8.107 | 10.582 | -0.967 | 13.626 |
| 94.99814057270362 | 7.851 | 10.212 | -1.034 | 13.19 |
| 95.16548902937897 | 7.595 | 9.918 | -1.1 | 12.811 |
| 95.33283748605432 | 7.339 | 9.691 | -1.166 | 12.488 |
| 95.50018594272963 | 7.093 | 9.52 | -1.223 | 12.213 |
| 95.66753439940499 | 6.875 | 9.416 | -1.271 | 12.005 |
| 95.83488285608034 | 6.666 | 9.368 | -1.318 | 11.862 |
| 96.00223131275567 | 6.486 | 9.359 | -1.365 | 11.768 |
| 96.16957976943102 | 6.353 | 9.397 | -1.403 | 11.73 |
| 96.33692822610638 | 6.249 | 9.454 | -1.432 | 11.73 |
| 96.50427668278171 | 6.192 | 9.539 | -1.451 | 11.786 |
| 96.67162513945706 | 6.163 | 9.653 | -1.46 | 11.881 |
| 96.8389735961324 | 6.154 | 9.833 | -1.46 | 12.033 |
| 96.99702491632577 | 6.116 | 10.08 | -1.46 | 12.232 |
| 97.16437337300111 | 6.078 | 10.383 | -1.451 | 12.488 |
| 97.33172182967647 | 6.04 | 10.743 | -1.432 | 12.782 |
| 97.49907028635181 | 5.993 | 11.17 | -1.403 | 13.123 |
| 97.66641874302715 | 5.964 | 11.635 | -1.375 | 13.522 |
| 97.8337671997025 | 5.936 | 12.156 | -1.318 | 13.958 |
| 98.00111565637785 | 5.907 | 12.716 | -1.261 | 14.451 |
| 98.16846411305319 | 5.898 | 13.323 | -1.195 | 14.982 |
| 98.33581256972855 | 5.888 | 13.986 | -1.109 | 15.57 |
| 98.50316102640389 | 5.907 | 14.688 | -1.015 | 16.215 |
| 98.67050948307921 | 5.936 | 15.418 | -0.91 | 16.888 |
| 98.83785793975456 | 5.974 | 16.167 | -0.806 | 17.59 |
| 99.0052063964299 | 6.031 | 16.878 | -0.692 | 18.272 |
| 99.17255485310525 | 6.069 | 17.523 | -0.588 | 18.879 |
| 99.33060617329863 | 6.088 | 18.064 | -0.493 | 19.391 |
| 99.49795462997399 | 6.107 | 18.519 | -0.417 | 19.818 |
| 99.66530308664933 | 6.126 | 18.87 | -0.351 | 20.15 |
| 99.83265154332467 | 6.135 | 19.116 | -0.313 | 20.387 |
| 100.0 | 6.154 | 19.249 | -0.284 | 20.52 |